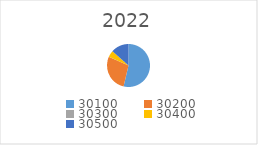
| Category | Series 0 |
|---|---|
| 30100.0 | 1323509 |
| 30200.0 | 687800 |
| 30300.0 | 1600 |
| 30400.0 | 120000 |
| 30500.0 | 331645 |